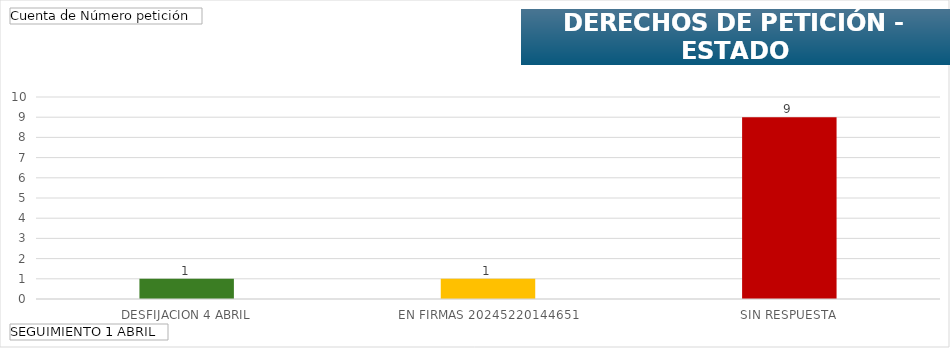
| Category | Total |
|---|---|
| DESFIJACION 4 ABRIL | 1 |
| EN FIRMAS 20245220144651 | 1 |
| SIN RESPUESTA | 9 |